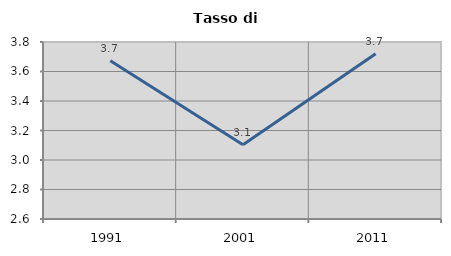
| Category | Tasso di disoccupazione   |
|---|---|
| 1991.0 | 3.672 |
| 2001.0 | 3.103 |
| 2011.0 | 3.72 |